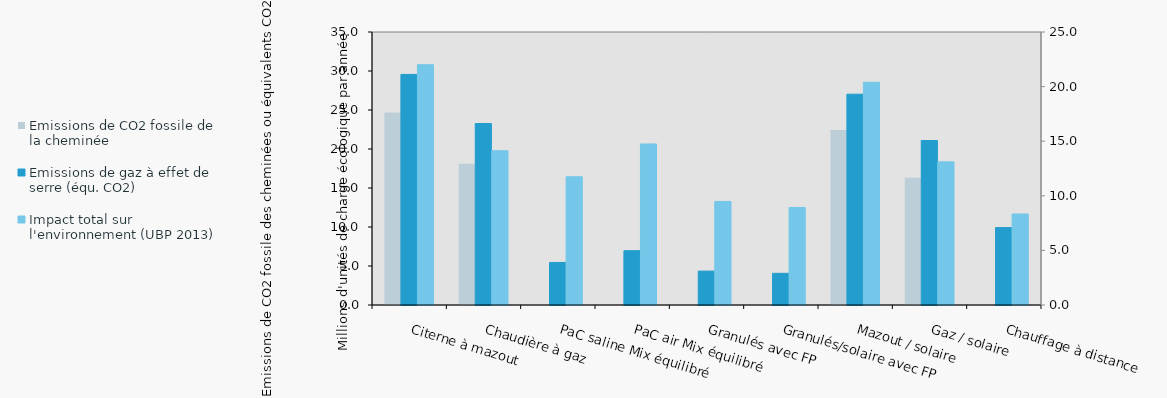
| Category | Emissions de CO2 fossile de la cheminée | Emissions de gaz à effet de serre (équ. CO2) | Platzhalter |
|---|---|---|---|
| Citerne à mazout | 24.676 | 29.563 |  |
| Chaudière à gaz | 18.117 | 23.266 |  |
| PaC saline Mix équilibré | 0 | 5.456 |  |
| PaC air Mix équilibré | 0 | 6.96 |  |
| Granulés avec FP | 0 | 4.347 |  |
| Granulés/solaire avec FP | 0 | 4.061 |  |
| Mazout / solaire | 22.435 | 27.027 |  |
| Gaz / solaire | 16.305 | 21.088 |  |
| Chauffage à distance | 0 | 9.924 |  |